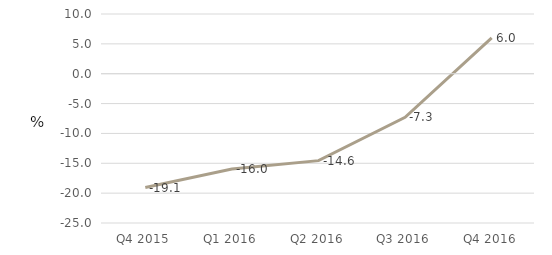
| Category | Non-Financial Corporations |
|---|---|
| Q4 2015 | -19.056 |
| Q1 2016 | -15.975 |
| Q2 2016 | -14.559 |
| Q3 2016 | -7.302 |
| Q4 2016 | 5.992 |